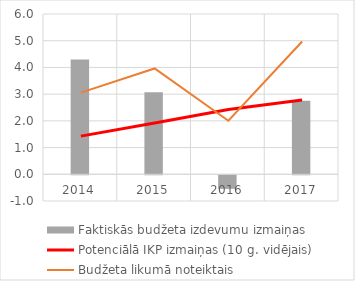
| Category | Faktiskās budžeta izdevumu izmaiņas |
|---|---|
| 2014.0 | 4.294 |
| 2015.0 | 3.067 |
| 2016.0 | -0.508 |
| 2017.0 | 2.754 |